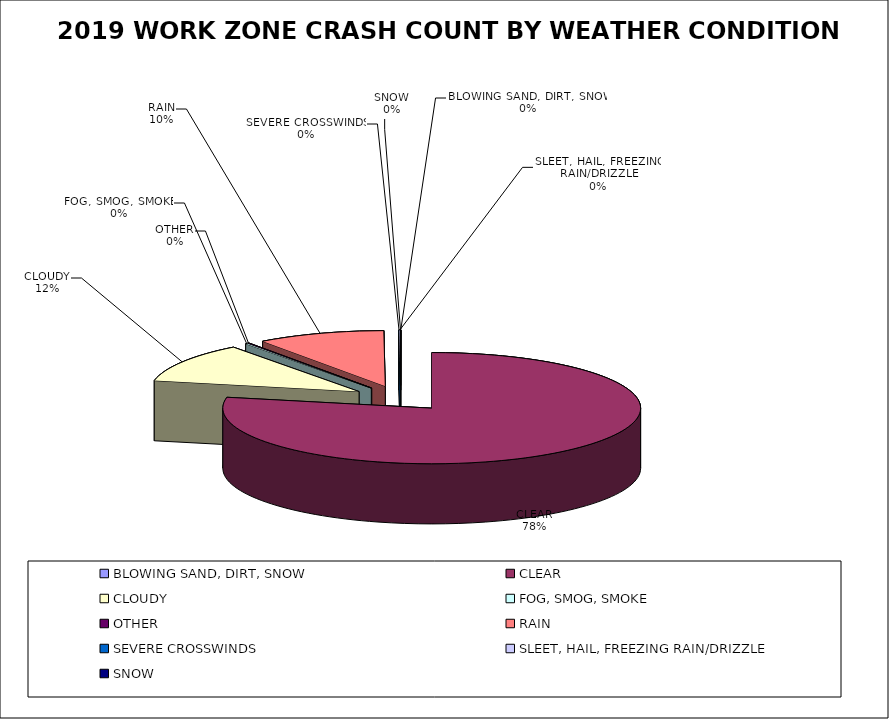
| Category | Series 0 | Series 1 |
|---|---|---|
| BLOWING SAND, DIRT, SNOW | 1 | 0 |
| CLEAR | 5492 | 0.781 |
| CLOUDY | 814 | 0.116 |
| FOG, SMOG, SMOKE | 13 | 0.002 |
| OTHER | 7 | 0.001 |
| RAIN | 694 | 0.099 |
| SEVERE CROSSWINDS | 2 | 0 |
| SLEET, HAIL, FREEZING RAIN/DRIZZLE | 5 | 0.001 |
| SNOW | 1 | 0 |